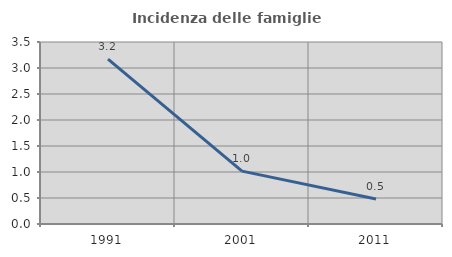
| Category | Incidenza delle famiglie numerose |
|---|---|
| 1991.0 | 3.171 |
| 2001.0 | 1.016 |
| 2011.0 | 0.482 |